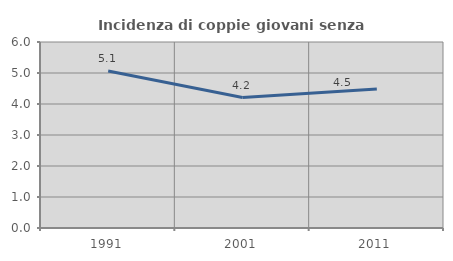
| Category | Incidenza di coppie giovani senza figli |
|---|---|
| 1991.0 | 5.062 |
| 2001.0 | 4.209 |
| 2011.0 | 4.482 |